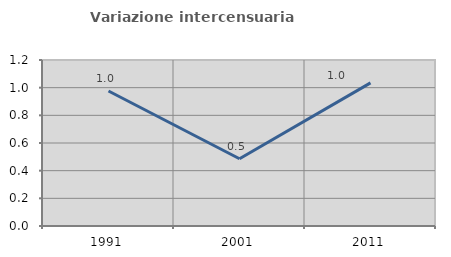
| Category | Variazione intercensuaria annua |
|---|---|
| 1991.0 | 0.976 |
| 2001.0 | 0.486 |
| 2011.0 | 1.035 |